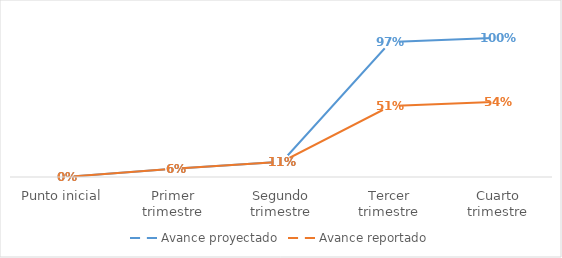
| Category | Avance proyectado | Avance reportado |
|---|---|---|
| Punto inicial | 0 | 0 |
| Primer trimestre | 0.06 | 0.06 |
| Segundo trimestre | 0.11 | 0.11 |
| Tercer trimestre | 0.97 | 0.51 |
| Cuarto trimestre | 1 | 0.54 |